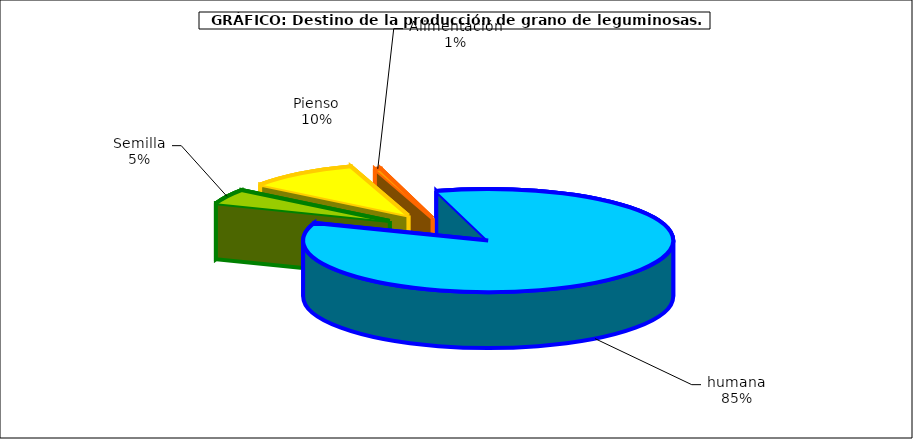
| Category | Series 0 |
|---|---|
| 0 | 31189 |
| 1 | 65398 |
| 2 | 3477 |
| 3 | 570655 |